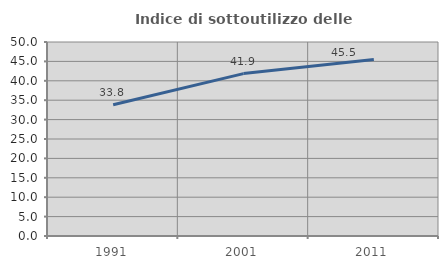
| Category | Indice di sottoutilizzo delle abitazioni  |
|---|---|
| 1991.0 | 33.846 |
| 2001.0 | 41.852 |
| 2011.0 | 45.469 |